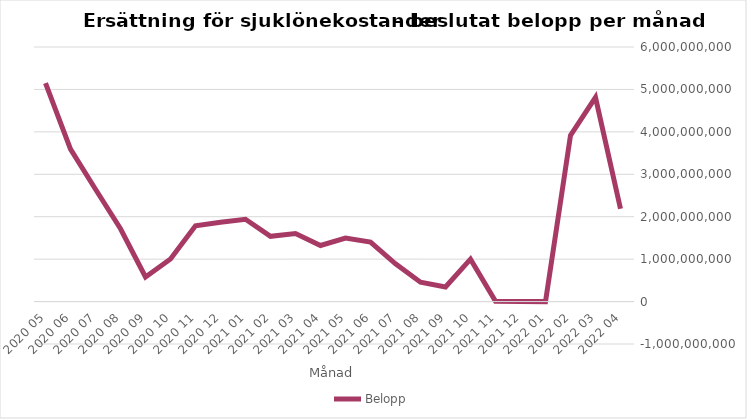
| Category | Belopp |
|---|---|
| 2022 04 | 2186515343 |
| 2022 03 | 4813187333 |
| 2022 02 | 3915082624 |
| 2022 01 | -1207177 |
| 2021 12 | 978242 |
| 2021 11 | 4565164 |
| 2021 10 | 999636800 |
| 2021 09 | 344377986 |
| 2021 08 | 455556201 |
| 2021 07 | 888208960 |
| 2021 06 | 1401405627 |
| 2021 05 | 1497714333 |
| 2021 04 | 1322493855 |
| 2021 03 | 1601944489 |
| 2021 02 | 1538386640 |
| 2021 01 | 1939072655 |
| 2020 12 | 1871516083 |
| 2020 11 | 1786452810 |
| 2020 10 | 1001939495 |
| 2020 09 | 580967175 |
| 2020 08 | 1716380937 |
| 2020 07 | 2647889145 |
| 2020 06 | 3593448392 |
| 2020 05 | 5146849866 |